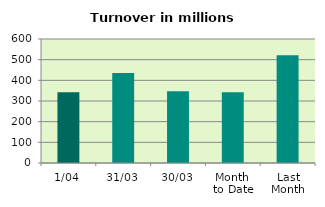
| Category | Series 0 |
|---|---|
| 1/04 | 341.937 |
| 31/03 | 435.876 |
| 30/03 | 346.739 |
| Month 
to Date | 341.937 |
| Last
Month | 521.26 |